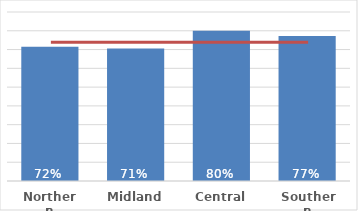
| Category | Māori |
|---|---|
| Northern | 0.715 |
| Midland | 0.706 |
| Central | 0.801 |
| Southern | 0.772 |